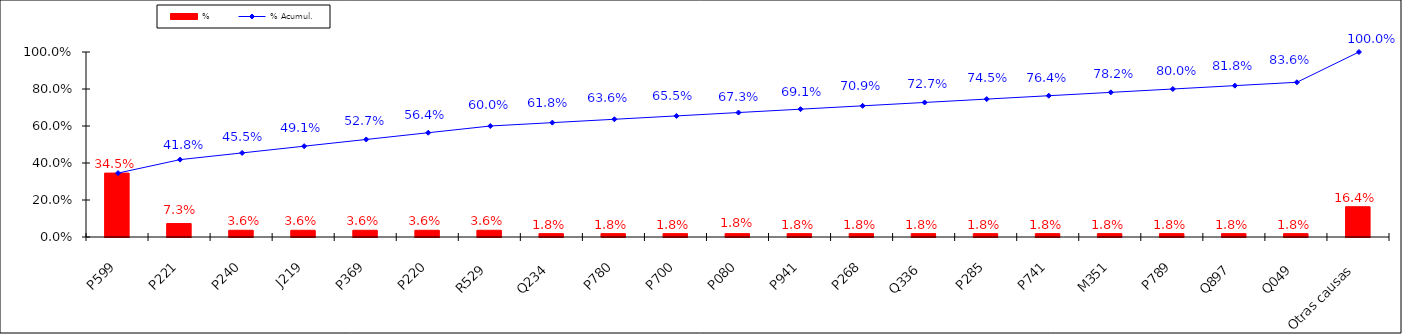
| Category | % |
|---|---|
| P599 | 0.345 |
| P221 | 0.073 |
| P240 | 0.036 |
| J219 | 0.036 |
| P369 | 0.036 |
| P220 | 0.036 |
| R529 | 0.036 |
| Q234 | 0.018 |
| P780 | 0.018 |
| P700 | 0.018 |
| P080 | 0.018 |
| P941 | 0.018 |
| P268 | 0.018 |
| Q336 | 0.018 |
| P285 | 0.018 |
| P741 | 0.018 |
| M351 | 0.018 |
| P789 | 0.018 |
| Q897 | 0.018 |
| Q049 | 0.018 |
| Otras causas | 0.164 |